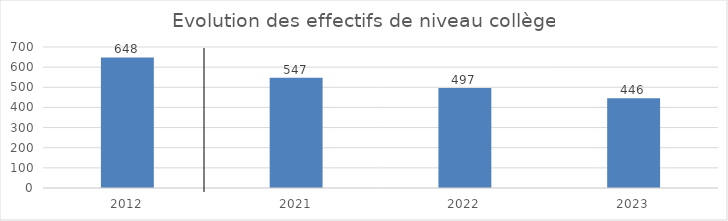
| Category | Series 0 |
|---|---|
| 2012.0 | 648 |
| 2021.0 | 547 |
| 2022.0 | 497 |
| 2023.0 | 446 |